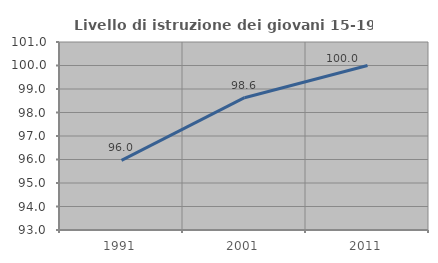
| Category | Livello di istruzione dei giovani 15-19 anni |
|---|---|
| 1991.0 | 95.96 |
| 2001.0 | 98.63 |
| 2011.0 | 100 |